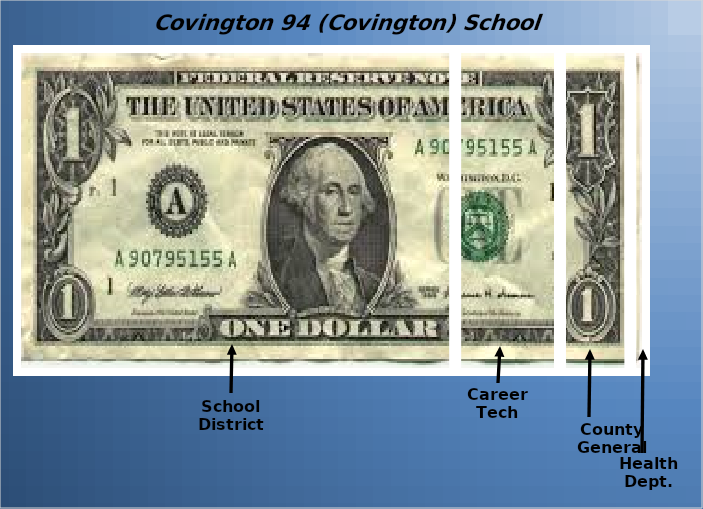
| Category | School District | Career Tech | County General | Health Dept. |
|---|---|---|---|---|
| 0 | 0.695 | 0.166 | 0.111 | 0.028 |